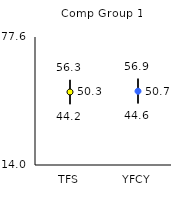
| Category | 25th | 75th | Mean |
|---|---|---|---|
| TFS | 44.2 | 56.3 | 50.28 |
| YFCY | 44.6 | 56.9 | 50.66 |